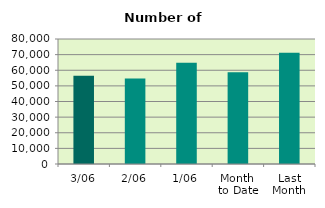
| Category | Series 0 |
|---|---|
| 3/06 | 56480 |
| 2/06 | 54728 |
| 1/06 | 64732 |
| Month 
to Date | 58646.667 |
| Last
Month | 71249.7 |